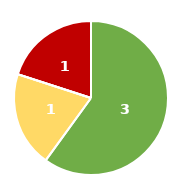
| Category | Series 0 |
|---|---|
| Niedrig | 3 |
| Mittel | 1 |
| Hoch | 0 |
| Kritisch | 1 |